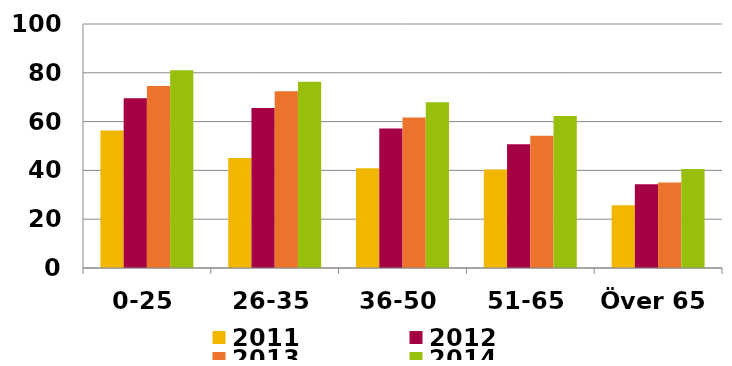
| Category | 2011 | 2012 | 2013 | 2014 |
|---|---|---|---|---|
| 0-25 | 56.364 | 69.581 | 74.591 | 81.052 |
| 26-35 | 45.068 | 65.558 | 72.414 | 76.313 |
| 36-50 | 40.888 | 57.124 | 61.685 | 67.901 |
| 51-65 | 40.344 | 50.671 | 54.221 | 62.264 |
| Över 65 | 25.704 | 34.315 | 35.011 | 40.563 |